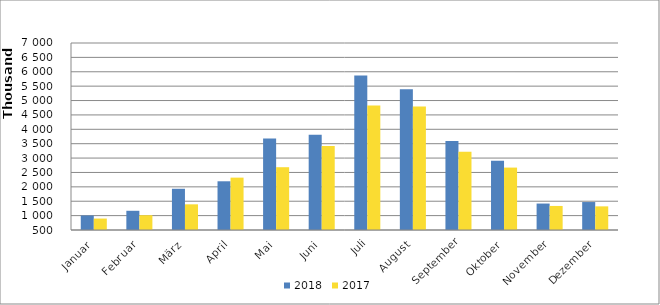
| Category | 2018 | 2017 |
|---|---|---|
| Januar | 1004968 | 897577 |
| Februar | 1167815 | 1014518 |
| März | 1932720 | 1392254 |
| April | 2193481 | 2320500 |
| Mai | 3676675 | 2682742 |
| Juni | 3811829 | 3416039 |
| Juli | 5874375 | 4828562 |
| August | 5395326 | 4795629 |
| September | 3597256 | 3217574 |
| Oktober | 2907416 | 2669133 |
| November | 1419396 | 1335705 |
| Dezember | 1471894 | 1321626 |